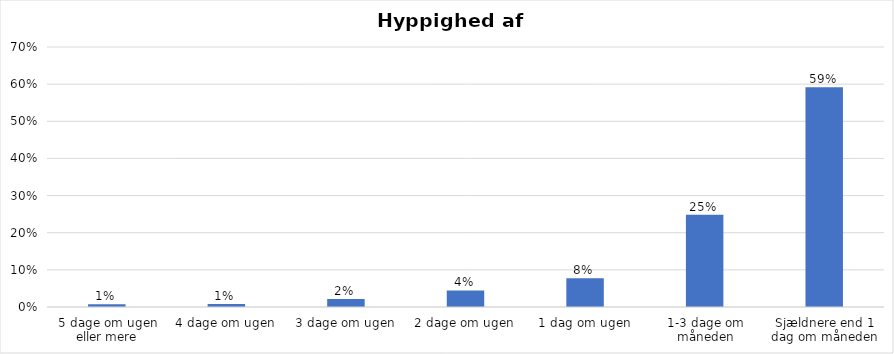
| Category | % |
|---|---|
| 5 dage om ugen eller mere | 0.008 |
| 4 dage om ugen | 0.008 |
| 3 dage om ugen | 0.022 |
| 2 dage om ugen | 0.044 |
| 1 dag om ugen | 0.078 |
| 1-3 dage om måneden | 0.249 |
| Sjældnere end 1 dag om måneden | 0.592 |